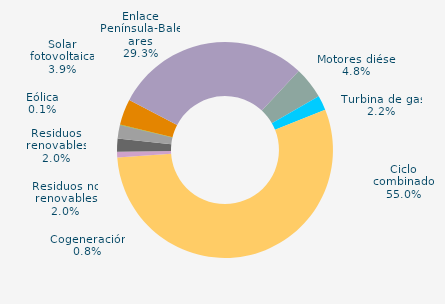
| Category | Series 0 |
|---|---|
| Carbón | 0 |
| Motores diésel | 4.778 |
| Turbina de gas | 2.19 |
| Ciclo combinado | 54.965 |
| Generación auxiliar | 0 |
| Cogeneración | 0.849 |
| Residuos no renovables | 1.987 |
| Residuos renovables | 1.987 |
| Eólica | 0.078 |
| Solar fotovoltaica | 3.876 |
| Otras renovables | 0.028 |
| Enlace Península-Baleares | 29.263 |